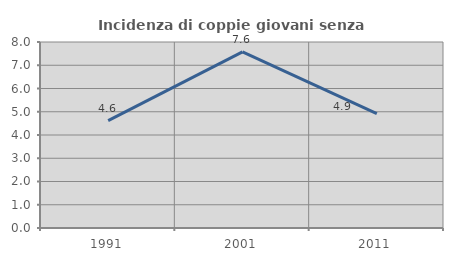
| Category | Incidenza di coppie giovani senza figli |
|---|---|
| 1991.0 | 4.615 |
| 2001.0 | 7.576 |
| 2011.0 | 4.918 |